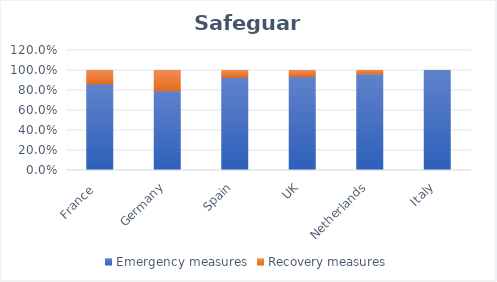
| Category | Emergency measures | Recovery measures |
|---|---|---|
| France  | 0.868 | 0.132 |
| Germany | 0.798 | 0.202 |
| Spain | 0.931 | 0.069 |
| UK | 0.941 | 0.059 |
| Netherlands | 0.965 | 0.035 |
| Italy | 1 | 0 |